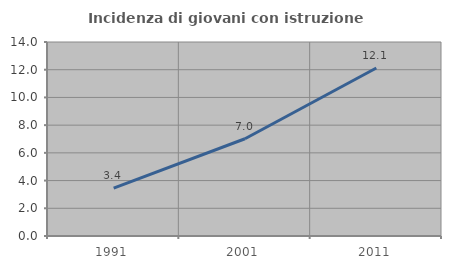
| Category | Incidenza di giovani con istruzione universitaria |
|---|---|
| 1991.0 | 3.448 |
| 2001.0 | 7.018 |
| 2011.0 | 12.121 |